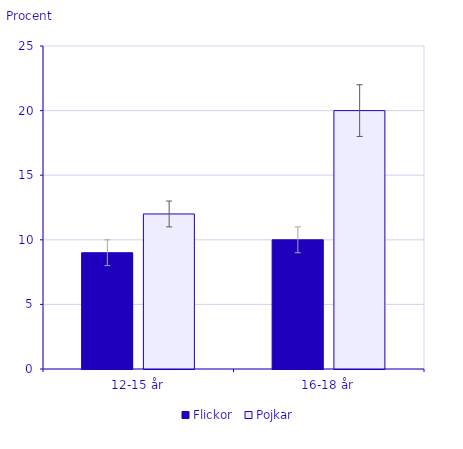
| Category | Flickor | Pojkar |
|---|---|---|
| 12-15 år | 9 | 12 |
| 16-18 år | 10 | 20 |